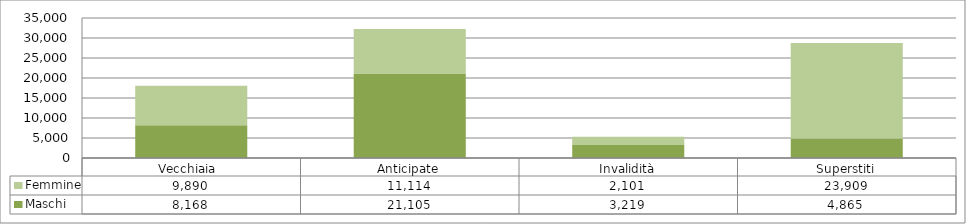
| Category | Maschi | Femmine |
|---|---|---|
| Vecchiaia  | 8168 | 9890 |
| Anticipate | 21105 | 11114 |
| Invalidità | 3219 | 2101 |
| Superstiti | 4865 | 23909 |